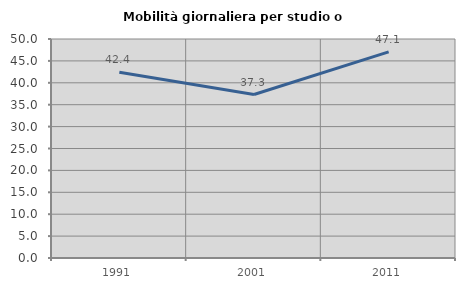
| Category | Mobilità giornaliera per studio o lavoro |
|---|---|
| 1991.0 | 42.429 |
| 2001.0 | 37.329 |
| 2011.0 | 47.052 |